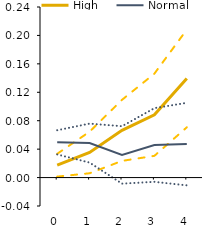
| Category | High | Series 4 | Series 5 | Normal | Series 1 | Series 2 |
|---|---|---|---|---|---|---|
| 0.0 | 0.017 | 0.033 | 0.001 | 0.05 | 0.067 | 0.033 |
| 1.0 | 0.035 | 0.065 | 0.006 | 0.048 | 0.076 | 0.021 |
| 2.0 | 0.066 | 0.109 | 0.023 | 0.032 | 0.072 | -0.009 |
| 3.0 | 0.088 | 0.146 | 0.031 | 0.046 | 0.098 | -0.006 |
| 4.0 | 0.139 | 0.208 | 0.071 | 0.047 | 0.105 | -0.011 |